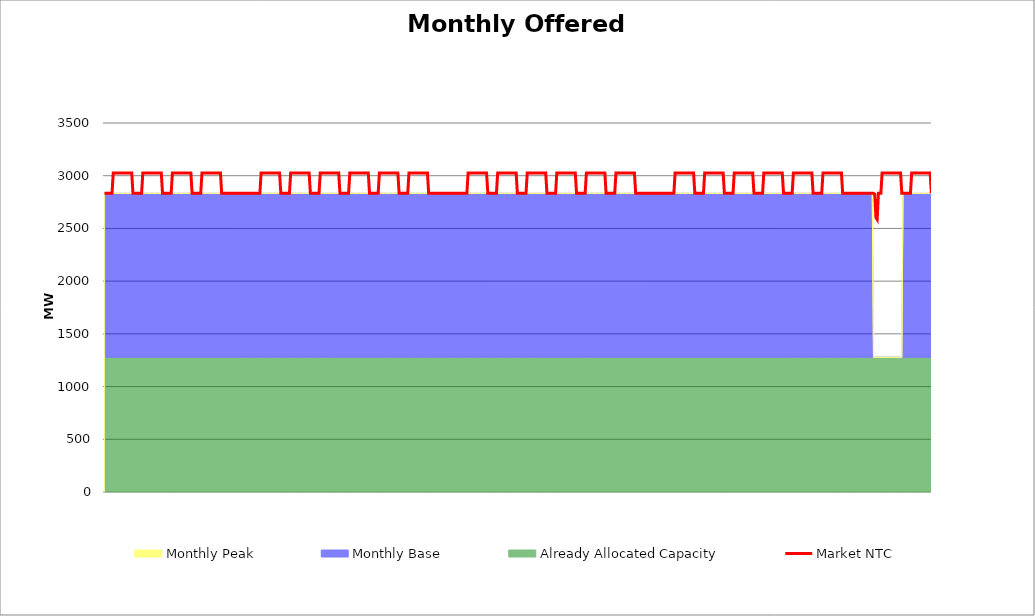
| Category | Market NTC |
|---|---|
| 0 | 2833 |
| 1 | 2833 |
| 2 | 2833 |
| 3 | 2833 |
| 4 | 2833 |
| 5 | 2833 |
| 6 | 2833 |
| 7 | 3025 |
| 8 | 3025 |
| 9 | 3025 |
| 10 | 3025 |
| 11 | 3025 |
| 12 | 3025 |
| 13 | 3025 |
| 14 | 3025 |
| 15 | 3025 |
| 16 | 3025 |
| 17 | 3025 |
| 18 | 3025 |
| 19 | 3025 |
| 20 | 3025 |
| 21 | 3025 |
| 22 | 3025 |
| 23 | 2833 |
| 24 | 2833 |
| 25 | 2833 |
| 26 | 2833 |
| 27 | 2833 |
| 28 | 2833 |
| 29 | 2833 |
| 30 | 2833 |
| 31 | 3025 |
| 32 | 3025 |
| 33 | 3025 |
| 34 | 3025 |
| 35 | 3025 |
| 36 | 3025 |
| 37 | 3025 |
| 38 | 3025 |
| 39 | 3025 |
| 40 | 3025 |
| 41 | 3025 |
| 42 | 3025 |
| 43 | 3025 |
| 44 | 3025 |
| 45 | 3025 |
| 46 | 3025 |
| 47 | 2833 |
| 48 | 2833 |
| 49 | 2833 |
| 50 | 2833 |
| 51 | 2833 |
| 52 | 2833 |
| 53 | 2833 |
| 54 | 2833 |
| 55 | 3025 |
| 56 | 3025 |
| 57 | 3025 |
| 58 | 3025 |
| 59 | 3025 |
| 60 | 3025 |
| 61 | 3025 |
| 62 | 3025 |
| 63 | 3025 |
| 64 | 3025 |
| 65 | 3025 |
| 66 | 3025 |
| 67 | 3025 |
| 68 | 3025 |
| 69 | 3025 |
| 70 | 3025 |
| 71 | 2833 |
| 72 | 2833 |
| 73 | 2833 |
| 74 | 2833 |
| 75 | 2833 |
| 76 | 2833 |
| 77 | 2833 |
| 78 | 2833 |
| 79 | 3025 |
| 80 | 3025 |
| 81 | 3025 |
| 82 | 3025 |
| 83 | 3025 |
| 84 | 3025 |
| 85 | 3025 |
| 86 | 3025 |
| 87 | 3025 |
| 88 | 3025 |
| 89 | 3025 |
| 90 | 3025 |
| 91 | 3025 |
| 92 | 3025 |
| 93 | 3025 |
| 94 | 3025 |
| 95 | 2833 |
| 96 | 2833 |
| 97 | 2833 |
| 98 | 2833 |
| 99 | 2833 |
| 100 | 2833 |
| 101 | 2833 |
| 102 | 2833 |
| 103 | 2833 |
| 104 | 2833 |
| 105 | 2833 |
| 106 | 2833 |
| 107 | 2833 |
| 108 | 2833 |
| 109 | 2833 |
| 110 | 2833 |
| 111 | 2833 |
| 112 | 2833 |
| 113 | 2833 |
| 114 | 2833 |
| 115 | 2833 |
| 116 | 2833 |
| 117 | 2833 |
| 118 | 2833 |
| 119 | 2833 |
| 120 | 2833 |
| 121 | 2833 |
| 122 | 2833 |
| 123 | 2833 |
| 124 | 2833 |
| 125 | 2833 |
| 126 | 2833 |
| 127 | 3025 |
| 128 | 3025 |
| 129 | 3025 |
| 130 | 3025 |
| 131 | 3025 |
| 132 | 3025 |
| 133 | 3025 |
| 134 | 3025 |
| 135 | 3025 |
| 136 | 3025 |
| 137 | 3025 |
| 138 | 3025 |
| 139 | 3025 |
| 140 | 3025 |
| 141 | 3025 |
| 142 | 3025 |
| 143 | 2833 |
| 144 | 2833 |
| 145 | 2833 |
| 146 | 2833 |
| 147 | 2833 |
| 148 | 2833 |
| 149 | 2833 |
| 150 | 2833 |
| 151 | 3025 |
| 152 | 3025 |
| 153 | 3025 |
| 154 | 3025 |
| 155 | 3025 |
| 156 | 3025 |
| 157 | 3025 |
| 158 | 3025 |
| 159 | 3025 |
| 160 | 3025 |
| 161 | 3025 |
| 162 | 3025 |
| 163 | 3025 |
| 164 | 3025 |
| 165 | 3025 |
| 166 | 3025 |
| 167 | 2833 |
| 168 | 2833 |
| 169 | 2833 |
| 170 | 2833 |
| 171 | 2833 |
| 172 | 2833 |
| 173 | 2833 |
| 174 | 2833 |
| 175 | 3025 |
| 176 | 3025 |
| 177 | 3025 |
| 178 | 3025 |
| 179 | 3025 |
| 180 | 3025 |
| 181 | 3025 |
| 182 | 3025 |
| 183 | 3025 |
| 184 | 3025 |
| 185 | 3025 |
| 186 | 3025 |
| 187 | 3025 |
| 188 | 3025 |
| 189 | 3025 |
| 190 | 3025 |
| 191 | 2833 |
| 192 | 2833 |
| 193 | 2833 |
| 194 | 2833 |
| 195 | 2833 |
| 196 | 2833 |
| 197 | 2833 |
| 198 | 2833 |
| 199 | 3025 |
| 200 | 3025 |
| 201 | 3025 |
| 202 | 3025 |
| 203 | 3025 |
| 204 | 3025 |
| 205 | 3025 |
| 206 | 3025 |
| 207 | 3025 |
| 208 | 3025 |
| 209 | 3025 |
| 210 | 3025 |
| 211 | 3025 |
| 212 | 3025 |
| 213 | 3025 |
| 214 | 3025 |
| 215 | 2833 |
| 216 | 2833 |
| 217 | 2833 |
| 218 | 2833 |
| 219 | 2833 |
| 220 | 2833 |
| 221 | 2833 |
| 222 | 2833 |
| 223 | 3025 |
| 224 | 3025 |
| 225 | 3025 |
| 226 | 3025 |
| 227 | 3025 |
| 228 | 3025 |
| 229 | 3025 |
| 230 | 3025 |
| 231 | 3025 |
| 232 | 3025 |
| 233 | 3025 |
| 234 | 3025 |
| 235 | 3025 |
| 236 | 3025 |
| 237 | 3025 |
| 238 | 3025 |
| 239 | 2833 |
| 240 | 2833 |
| 241 | 2833 |
| 242 | 2833 |
| 243 | 2833 |
| 244 | 2833 |
| 245 | 2833 |
| 246 | 2833 |
| 247 | 3025 |
| 248 | 3025 |
| 249 | 3025 |
| 250 | 3025 |
| 251 | 3025 |
| 252 | 3025 |
| 253 | 3025 |
| 254 | 3025 |
| 255 | 3025 |
| 256 | 3025 |
| 257 | 3025 |
| 258 | 3025 |
| 259 | 3025 |
| 260 | 3025 |
| 261 | 3025 |
| 262 | 3025 |
| 263 | 2833 |
| 264 | 2833 |
| 265 | 2833 |
| 266 | 2833 |
| 267 | 2833 |
| 268 | 2833 |
| 269 | 2833 |
| 270 | 2833 |
| 271 | 2833 |
| 272 | 2833 |
| 273 | 2833 |
| 274 | 2833 |
| 275 | 2833 |
| 276 | 2833 |
| 277 | 2833 |
| 278 | 2833 |
| 279 | 2833 |
| 280 | 2833 |
| 281 | 2833 |
| 282 | 2833 |
| 283 | 2833 |
| 284 | 2833 |
| 285 | 2833 |
| 286 | 2833 |
| 287 | 2833 |
| 288 | 2833 |
| 289 | 2833 |
| 290 | 2833 |
| 291 | 2833 |
| 292 | 2833 |
| 293 | 2833 |
| 294 | 2833 |
| 295 | 3025 |
| 296 | 3025 |
| 297 | 3025 |
| 298 | 3025 |
| 299 | 3025 |
| 300 | 3025 |
| 301 | 3025 |
| 302 | 3025 |
| 303 | 3025 |
| 304 | 3025 |
| 305 | 3025 |
| 306 | 3025 |
| 307 | 3025 |
| 308 | 3025 |
| 309 | 3025 |
| 310 | 3025 |
| 311 | 2833 |
| 312 | 2833 |
| 313 | 2833 |
| 314 | 2833 |
| 315 | 2833 |
| 316 | 2833 |
| 317 | 2833 |
| 318 | 2833 |
| 319 | 3025 |
| 320 | 3025 |
| 321 | 3025 |
| 322 | 3025 |
| 323 | 3025 |
| 324 | 3025 |
| 325 | 3025 |
| 326 | 3025 |
| 327 | 3025 |
| 328 | 3025 |
| 329 | 3025 |
| 330 | 3025 |
| 331 | 3025 |
| 332 | 3025 |
| 333 | 3025 |
| 334 | 3025 |
| 335 | 2833 |
| 336 | 2833 |
| 337 | 2833 |
| 338 | 2833 |
| 339 | 2833 |
| 340 | 2833 |
| 341 | 2833 |
| 342 | 2833 |
| 343 | 3025 |
| 344 | 3025 |
| 345 | 3025 |
| 346 | 3025 |
| 347 | 3025 |
| 348 | 3025 |
| 349 | 3025 |
| 350 | 3025 |
| 351 | 3025 |
| 352 | 3025 |
| 353 | 3025 |
| 354 | 3025 |
| 355 | 3025 |
| 356 | 3025 |
| 357 | 3025 |
| 358 | 3025 |
| 359 | 2833 |
| 360 | 2833 |
| 361 | 2833 |
| 362 | 2833 |
| 363 | 2833 |
| 364 | 2833 |
| 365 | 2833 |
| 366 | 2833 |
| 367 | 3025 |
| 368 | 3025 |
| 369 | 3025 |
| 370 | 3025 |
| 371 | 3025 |
| 372 | 3025 |
| 373 | 3025 |
| 374 | 3025 |
| 375 | 3025 |
| 376 | 3025 |
| 377 | 3025 |
| 378 | 3025 |
| 379 | 3025 |
| 380 | 3025 |
| 381 | 3025 |
| 382 | 3025 |
| 383 | 2833 |
| 384 | 2833 |
| 385 | 2833 |
| 386 | 2833 |
| 387 | 2833 |
| 388 | 2833 |
| 389 | 2833 |
| 390 | 2833 |
| 391 | 3025 |
| 392 | 3025 |
| 393 | 3025 |
| 394 | 3025 |
| 395 | 3025 |
| 396 | 3025 |
| 397 | 3025 |
| 398 | 3025 |
| 399 | 3025 |
| 400 | 3025 |
| 401 | 3025 |
| 402 | 3025 |
| 403 | 3025 |
| 404 | 3025 |
| 405 | 3025 |
| 406 | 3025 |
| 407 | 2833 |
| 408 | 2833 |
| 409 | 2833 |
| 410 | 2833 |
| 411 | 2833 |
| 412 | 2833 |
| 413 | 2833 |
| 414 | 2833 |
| 415 | 3025 |
| 416 | 3025 |
| 417 | 3025 |
| 418 | 3025 |
| 419 | 3025 |
| 420 | 3025 |
| 421 | 3025 |
| 422 | 3025 |
| 423 | 3025 |
| 424 | 3025 |
| 425 | 3025 |
| 426 | 3025 |
| 427 | 3025 |
| 428 | 3025 |
| 429 | 3025 |
| 430 | 3025 |
| 431 | 2833 |
| 432 | 2833 |
| 433 | 2833 |
| 434 | 2833 |
| 435 | 2833 |
| 436 | 2833 |
| 437 | 2833 |
| 438 | 2833 |
| 439 | 2833 |
| 440 | 2833 |
| 441 | 2833 |
| 442 | 2833 |
| 443 | 2833 |
| 444 | 2833 |
| 445 | 2833 |
| 446 | 2833 |
| 447 | 2833 |
| 448 | 2833 |
| 449 | 2833 |
| 450 | 2833 |
| 451 | 2833 |
| 452 | 2833 |
| 453 | 2833 |
| 454 | 2833 |
| 455 | 2833 |
| 456 | 2833 |
| 457 | 2833 |
| 458 | 2833 |
| 459 | 2833 |
| 460 | 2833 |
| 461 | 2833 |
| 462 | 2833 |
| 463 | 3025 |
| 464 | 3025 |
| 465 | 3025 |
| 466 | 3025 |
| 467 | 3025 |
| 468 | 3025 |
| 469 | 3025 |
| 470 | 3025 |
| 471 | 3025 |
| 472 | 3025 |
| 473 | 3025 |
| 474 | 3025 |
| 475 | 3025 |
| 476 | 3025 |
| 477 | 3025 |
| 478 | 3025 |
| 479 | 2833 |
| 480 | 2833 |
| 481 | 2833 |
| 482 | 2833 |
| 483 | 2833 |
| 484 | 2833 |
| 485 | 2833 |
| 486 | 2833 |
| 487 | 3025 |
| 488 | 3025 |
| 489 | 3025 |
| 490 | 3025 |
| 491 | 3025 |
| 492 | 3025 |
| 493 | 3025 |
| 494 | 3025 |
| 495 | 3025 |
| 496 | 3025 |
| 497 | 3025 |
| 498 | 3025 |
| 499 | 3025 |
| 500 | 3025 |
| 501 | 3025 |
| 502 | 3025 |
| 503 | 2833 |
| 504 | 2833 |
| 505 | 2833 |
| 506 | 2833 |
| 507 | 2833 |
| 508 | 2833 |
| 509 | 2833 |
| 510 | 2833 |
| 511 | 3025 |
| 512 | 3025 |
| 513 | 3025 |
| 514 | 3025 |
| 515 | 3025 |
| 516 | 3025 |
| 517 | 3025 |
| 518 | 3025 |
| 519 | 3025 |
| 520 | 3025 |
| 521 | 3025 |
| 522 | 3025 |
| 523 | 3025 |
| 524 | 3025 |
| 525 | 3025 |
| 526 | 3025 |
| 527 | 2833 |
| 528 | 2833 |
| 529 | 2833 |
| 530 | 2833 |
| 531 | 2833 |
| 532 | 2833 |
| 533 | 2833 |
| 534 | 2833 |
| 535 | 3025 |
| 536 | 3025 |
| 537 | 3025 |
| 538 | 3025 |
| 539 | 3025 |
| 540 | 3025 |
| 541 | 3025 |
| 542 | 3025 |
| 543 | 3025 |
| 544 | 3025 |
| 545 | 3025 |
| 546 | 3025 |
| 547 | 3025 |
| 548 | 3025 |
| 549 | 3025 |
| 550 | 3025 |
| 551 | 2833 |
| 552 | 2833 |
| 553 | 2833 |
| 554 | 2833 |
| 555 | 2833 |
| 556 | 2833 |
| 557 | 2833 |
| 558 | 2833 |
| 559 | 3025 |
| 560 | 3025 |
| 561 | 3025 |
| 562 | 3025 |
| 563 | 3025 |
| 564 | 3025 |
| 565 | 3025 |
| 566 | 3025 |
| 567 | 3025 |
| 568 | 3025 |
| 569 | 3025 |
| 570 | 3025 |
| 571 | 3025 |
| 572 | 3025 |
| 573 | 3025 |
| 574 | 3025 |
| 575 | 2833 |
| 576 | 2833 |
| 577 | 2833 |
| 578 | 2833 |
| 579 | 2833 |
| 580 | 2833 |
| 581 | 2833 |
| 582 | 2833 |
| 583 | 3025 |
| 584 | 3025 |
| 585 | 3025 |
| 586 | 3025 |
| 587 | 3025 |
| 588 | 3025 |
| 589 | 3025 |
| 590 | 3025 |
| 591 | 3025 |
| 592 | 3025 |
| 593 | 3025 |
| 594 | 3025 |
| 595 | 3025 |
| 596 | 3025 |
| 597 | 3025 |
| 598 | 3025 |
| 599 | 2833 |
| 600 | 2833 |
| 601 | 2833 |
| 602 | 2833 |
| 603 | 2833 |
| 604 | 2833 |
| 605 | 2833 |
| 606 | 2833 |
| 607 | 2833 |
| 608 | 2833 |
| 609 | 2833 |
| 610 | 2833 |
| 611 | 2833 |
| 612 | 2833 |
| 613 | 2833 |
| 614 | 2833 |
| 615 | 2833 |
| 616 | 2833 |
| 617 | 2833 |
| 618 | 2833 |
| 619 | 2833 |
| 620 | 2833 |
| 621 | 2833 |
| 622 | 2833 |
| 623 | 2833 |
| 624 | 2833 |
| 625 | 2824 |
| 626 | 2602 |
| 627 | 2584 |
| 628 | 2833 |
| 629 | 2833 |
| 630 | 2833 |
| 631 | 3025 |
| 632 | 3025 |
| 633 | 3025 |
| 634 | 3025 |
| 635 | 3025 |
| 636 | 3025 |
| 637 | 3025 |
| 638 | 3025 |
| 639 | 3025 |
| 640 | 3025 |
| 641 | 3025 |
| 642 | 3025 |
| 643 | 3025 |
| 644 | 3025 |
| 645 | 3025 |
| 646 | 3025 |
| 647 | 2833 |
| 648 | 2833 |
| 649 | 2833 |
| 650 | 2833 |
| 651 | 2833 |
| 652 | 2833 |
| 653 | 2833 |
| 654 | 2833 |
| 655 | 3025 |
| 656 | 3025 |
| 657 | 3025 |
| 658 | 3025 |
| 659 | 3025 |
| 660 | 3025 |
| 661 | 3025 |
| 662 | 3025 |
| 663 | 3025 |
| 664 | 3025 |
| 665 | 3025 |
| 666 | 3025 |
| 667 | 3025 |
| 668 | 3025 |
| 669 | 3025 |
| 670 | 3025 |
| 671 | 2833 |